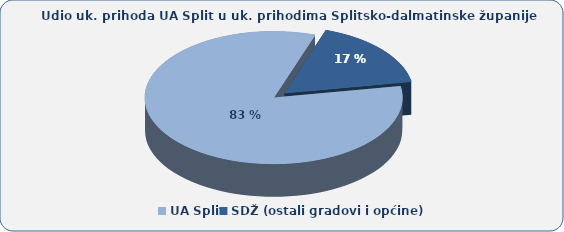
| Category | Series 1 |
|---|---|
| UA Split | 82.977 |
| SDŽ (ostali gradovi i općine) | 17.023 |